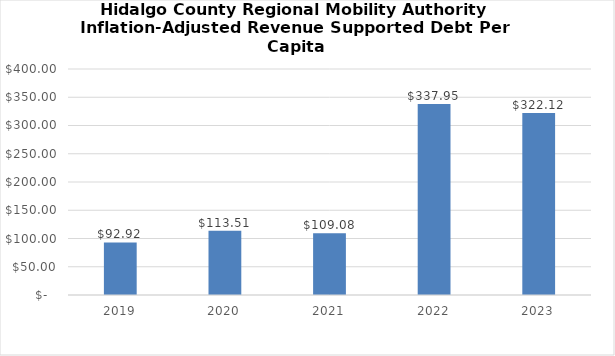
| Category | Series 0 |
|---|---|
| 2019.0 | 92.923 |
| 2020.0 | 113.508 |
| 2021.0 | 109.076 |
| 2022.0 | 337.949 |
| 2023.0 | 322.122 |